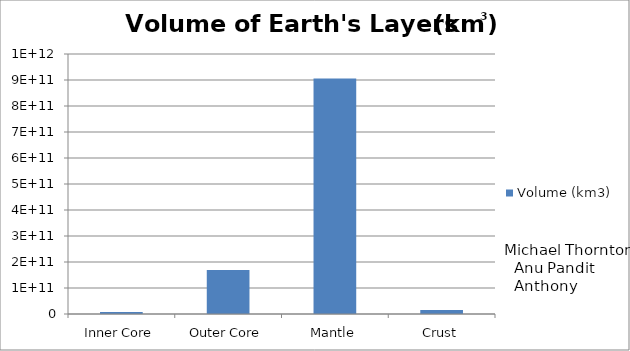
| Category | Volume (km3) |
|---|---|
| Inner Core | 7602350293.333 |
| Outer Core | 168841333546.667 |
| Mantle | 905704367386.667 |
| Crust | 15361495440 |